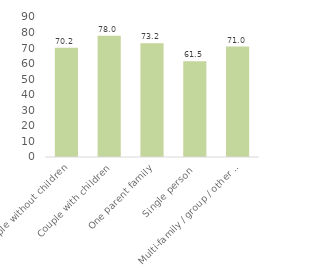
| Category | Series 0 |
|---|---|
| Couple without children | 70.211 |
| Couple with children | 77.966 |
| One parent family | 73.171 |
| Single person | 61.525 |
| Multi-family / group / other household | 71.021 |